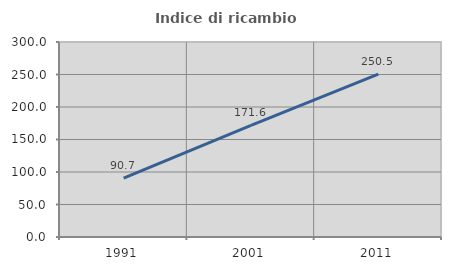
| Category | Indice di ricambio occupazionale  |
|---|---|
| 1991.0 | 90.678 |
| 2001.0 | 171.579 |
| 2011.0 | 250.485 |